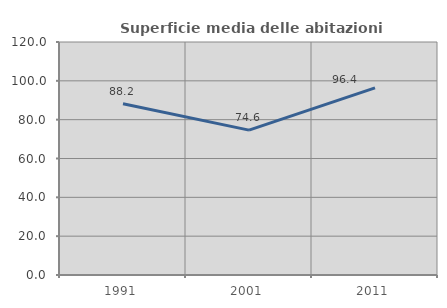
| Category | Superficie media delle abitazioni occupate |
|---|---|
| 1991.0 | 88.213 |
| 2001.0 | 74.617 |
| 2011.0 | 96.362 |